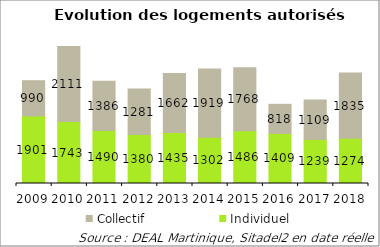
| Category | Individuel | Collectif |
|---|---|---|
| 2009.0 | 1901 | 990 |
| 2010.0 | 1743 | 2111 |
| 2011.0 | 1490 | 1386 |
| 2012.0 | 1380 | 1281 |
| 2013.0 | 1435 | 1662 |
| 2014.0 | 1302 | 1919 |
| 2015.0 | 1486 | 1768 |
| 2016.0 | 1409 | 818 |
| 2017.0 | 1239 | 1109 |
| 2018.0 | 1274 | 1835 |